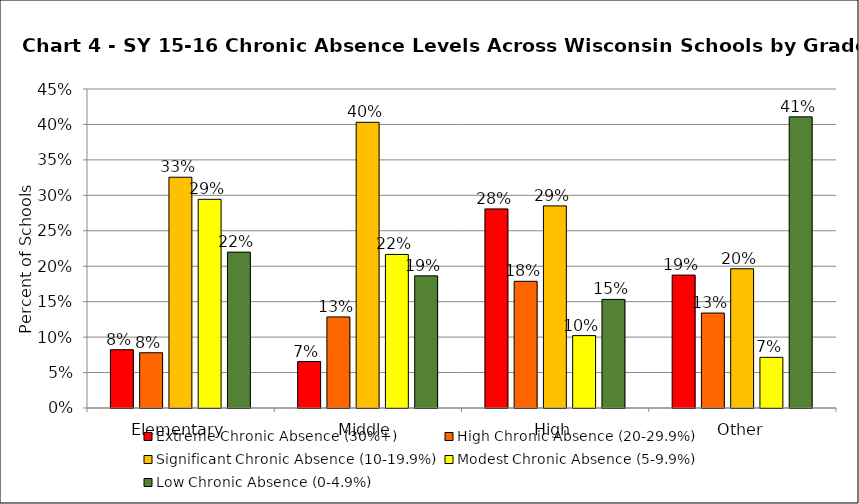
| Category | Extreme Chronic Absence (30%+) | High Chronic Absence (20-29.9%) | Significant Chronic Absence (10-19.9%) | Modest Chronic Absence (5-9.9%) | Low Chronic Absence (0-4.9%) |
|---|---|---|---|---|---|
| 0 | 0.082 | 0.078 | 0.326 | 0.294 | 0.22 |
| 1 | 0.065 | 0.128 | 0.403 | 0.217 | 0.186 |
| 2 | 0.281 | 0.179 | 0.285 | 0.102 | 0.153 |
| 3 | 0.188 | 0.134 | 0.196 | 0.071 | 0.411 |